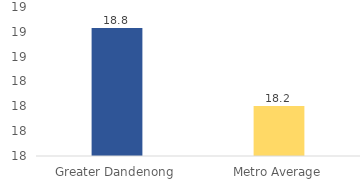
| Category | Series 0 |
|---|---|
| Greater Dandenong | 18.83 |
| Metro Average | 18.203 |